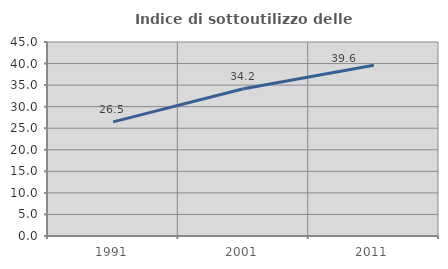
| Category | Indice di sottoutilizzo delle abitazioni  |
|---|---|
| 1991.0 | 26.473 |
| 2001.0 | 34.154 |
| 2011.0 | 39.59 |